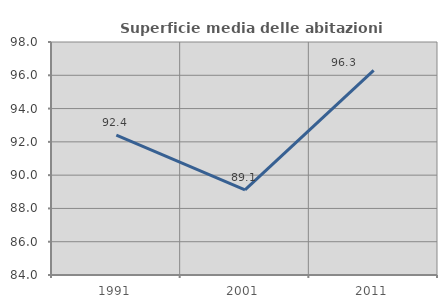
| Category | Superficie media delle abitazioni occupate |
|---|---|
| 1991.0 | 92.401 |
| 2001.0 | 89.111 |
| 2011.0 | 96.298 |